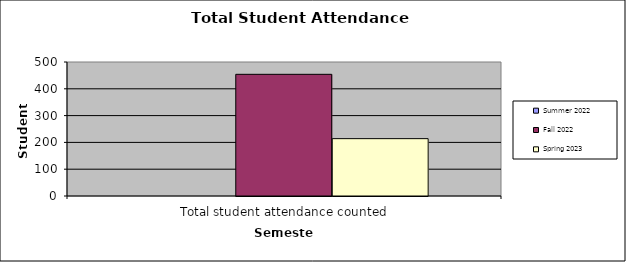
| Category | Summer 2022 | Fall 2022 | Spring 2023 |
|---|---|---|---|
| Total student attendance counted | 0 | 454 | 214 |